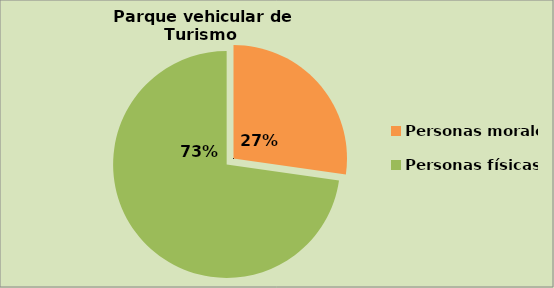
| Category | Series 0 |
|---|---|
| Personas morales | 27.256 |
| Personas físicas | 72.744 |